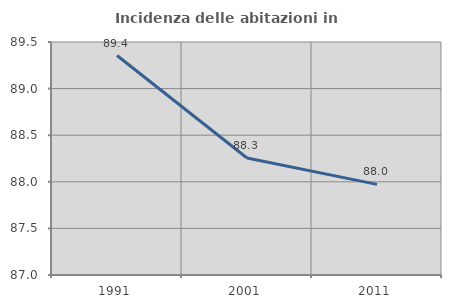
| Category | Incidenza delle abitazioni in proprietà  |
|---|---|
| 1991.0 | 89.355 |
| 2001.0 | 88.255 |
| 2011.0 | 87.973 |